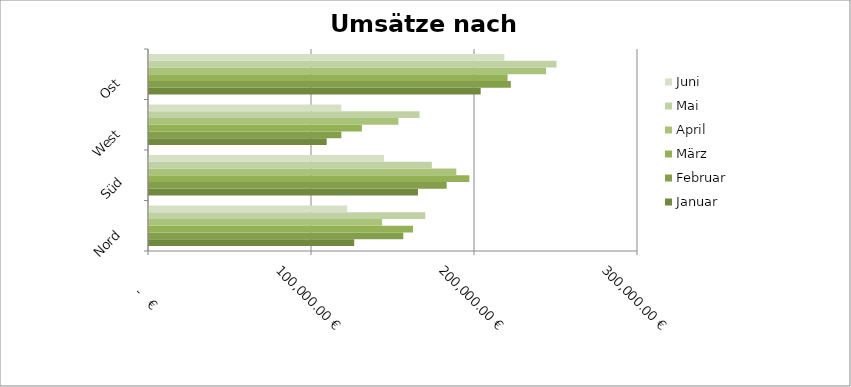
| Category | Januar | Februar | März | April | Mai | Juni |
|---|---|---|---|---|---|---|
| Nord | 125890 | 156000 | 162000 | 143000 | 169500 | 121580 |
| Süd | 165000 | 182632 | 196523 | 188523 | 173500 | 144200 |
| West | 109000 | 118000 | 130600 | 153000 | 166000 | 118000 |
| Ost | 203500 | 222000 | 220000 | 243580 | 250000 | 218000 |